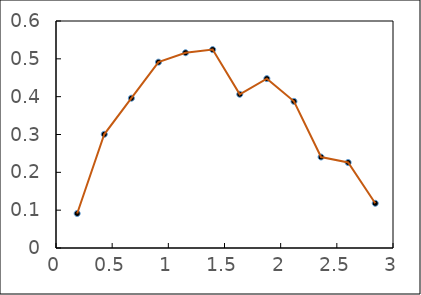
| Category | Series 0 |
|---|---|
| 0.1885390464551071 | 0.091 |
| 0.42975685721145496 | 0.301 |
| 0.6709746679678028 | 0.396 |
| 0.9121924787241507 | 0.491 |
| 1.1534102894804985 | 0.516 |
| 1.3946281002368461 | 0.524 |
| 1.6358459109931942 | 0.406 |
| 1.8770637217495418 | 0.448 |
| 2.11828153250589 | 0.388 |
| 2.3594993432622378 | 0.24 |
| 2.600717154018586 | 0.226 |
| 2.8419349647749335 | 0.118 |